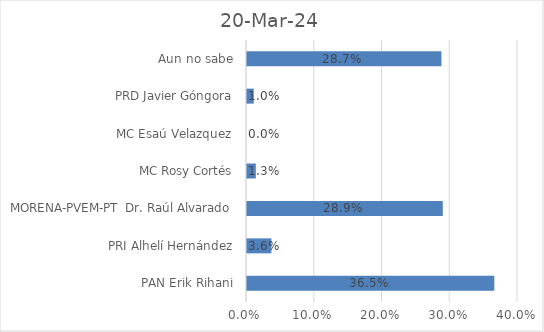
| Category | 20-mar-24 |
|---|---|
| PAN Erik Rihani | 0.365 |
| PRI Alhelí Hernández | 0.036 |
| MORENA-PVEM-PT  Dr. Raúl Alvarado | 0.289 |
| MC Rosy Cortés | 0.013 |
| MC Esaú Velazquez | 0 |
| PRD Javier Góngora | 0.01 |
| Aun no sabe | 0.287 |